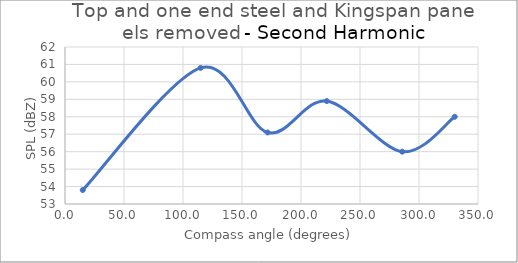
| Category | Series 0 |
|---|---|
| 15.06445125542554 | 53.8 |
| 115.00449447818254 | 60.8 |
| 171.7068171198818 | 57.1 |
| 221.8691292075067 | 58.9 |
| 285.7828166838848 | 56 |
| 330.28010595813004 | 58 |